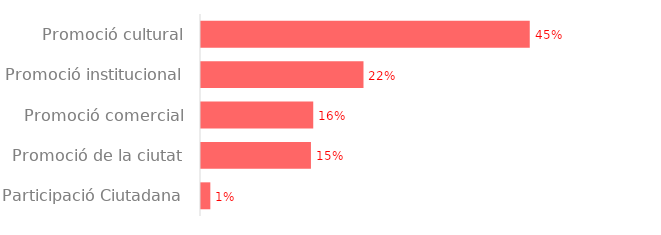
| Category | Series 0 |
|---|---|
| Promoció cultural | 15080.62 |
| Promoció institucional | 7453.6 |
| Promoció comercial | 5148.55 |
| Promoció de la ciutat | 5043.28 |
| Participació Ciutadana | 427.74 |